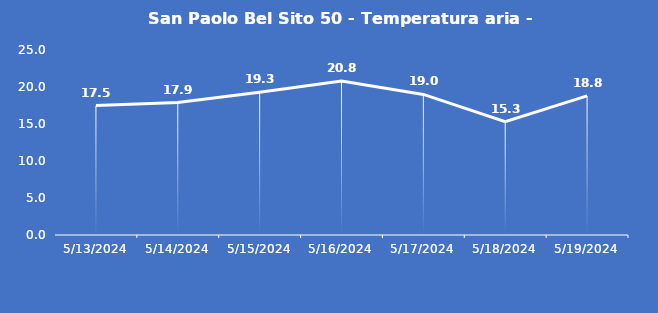
| Category | San Paolo Bel Sito 50 - Temperatura aria - Grezzo (°C) |
|---|---|
| 5/13/24 | 17.5 |
| 5/14/24 | 17.9 |
| 5/15/24 | 19.3 |
| 5/16/24 | 20.8 |
| 5/17/24 | 19 |
| 5/18/24 | 15.3 |
| 5/19/24 | 18.8 |